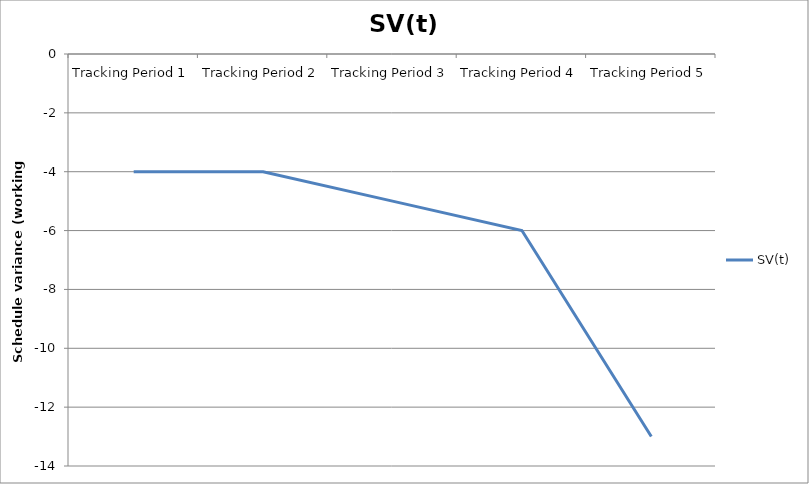
| Category | SV(t) |
|---|---|
| Tracking Period 1 | -4 |
| Tracking Period 2 | -4 |
| Tracking Period 3 | -5 |
| Tracking Period 4 | -6 |
| Tracking Period 5 | -13 |